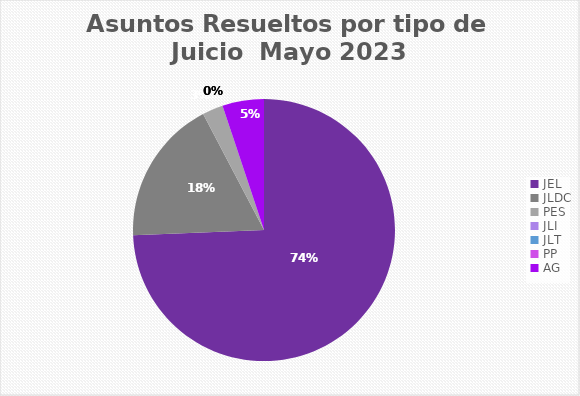
| Category | Asuntos Resueltos por tipo de Juicio  MAYO |
|---|---|
| JEL | 29 |
| JLDC | 7 |
| PES | 1 |
| JLI | 0 |
| JLT | 0 |
| PP | 0 |
| AG | 2 |